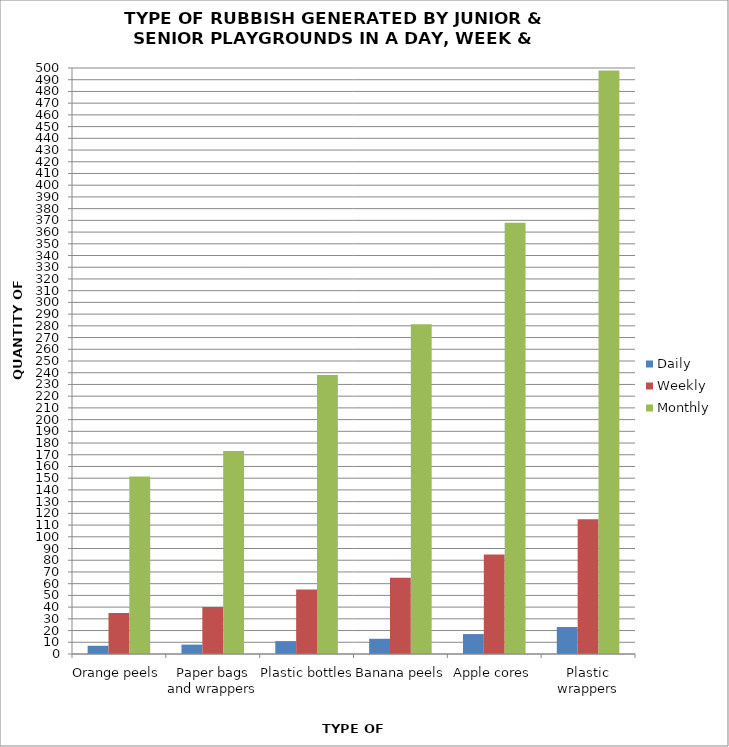
| Category | Daily | Weekly | Monthly |
|---|---|---|---|
| Orange peels | 7 | 35 | 151.55 |
| Paper bags and wrappers | 8 | 40 | 173.2 |
| Plastic bottles | 11 | 55 | 238.15 |
| Banana peels | 13 | 65 | 281.45 |
| Apple cores | 17 | 85 | 368.05 |
| Plastic wrappers | 23 | 115 | 497.95 |